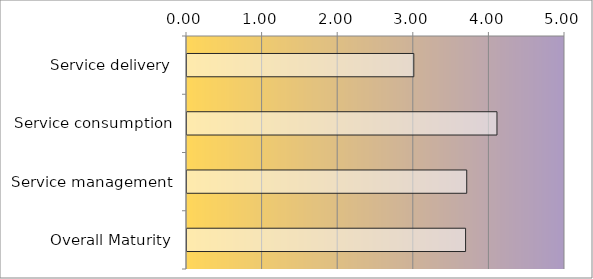
| Category | Series 0 |
|---|---|
| Service delivery | 3 |
| Service consumption | 4.1 |
| Service management | 3.7 |
| Overall Maturity | 3.685 |